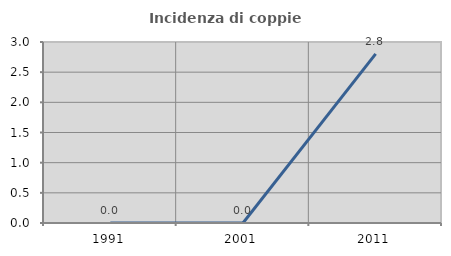
| Category | Incidenza di coppie miste |
|---|---|
| 1991.0 | 0 |
| 2001.0 | 0 |
| 2011.0 | 2.804 |